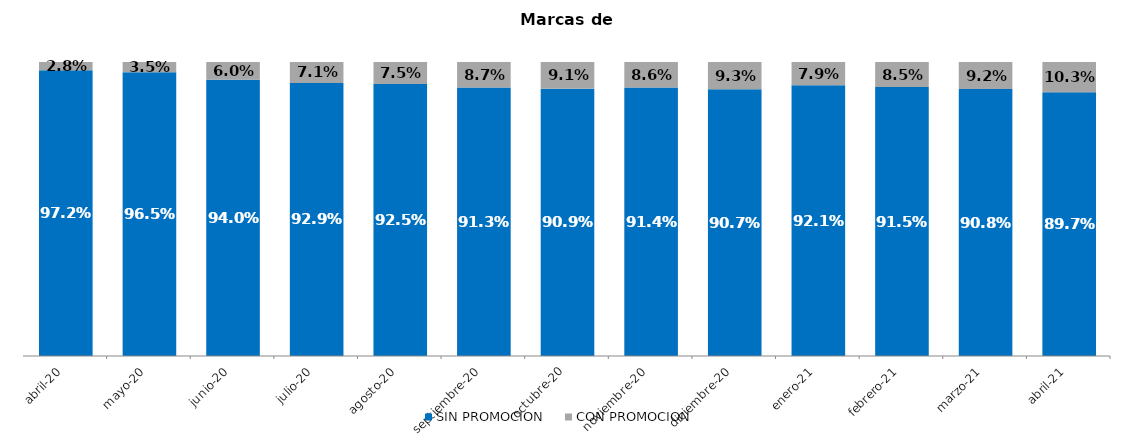
| Category | SIN PROMOCION   | CON PROMOCION   |
|---|---|---|
| 2020-04-01 | 0.972 | 0.028 |
| 2020-05-01 | 0.965 | 0.035 |
| 2020-06-01 | 0.94 | 0.06 |
| 2020-07-01 | 0.929 | 0.071 |
| 2020-08-01 | 0.925 | 0.075 |
| 2020-09-01 | 0.913 | 0.087 |
| 2020-10-01 | 0.909 | 0.091 |
| 2020-11-01 | 0.914 | 0.086 |
| 2020-12-01 | 0.907 | 0.093 |
| 2021-01-01 | 0.921 | 0.079 |
| 2021-02-01 | 0.915 | 0.085 |
| 2021-03-01 | 0.908 | 0.092 |
| 2021-04-01 | 0.897 | 0.103 |